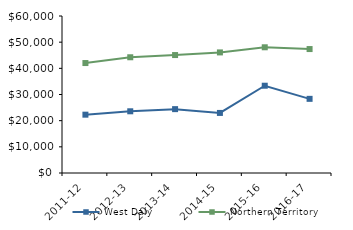
| Category | West Daly | Northern Territory |
|---|---|---|
| 2011-12 | 22290 | 42021 |
| 2012-13 | 23584.21 | 44232.02 |
| 2013-14 | 24406.63 | 45075.51 |
| 2014-15 | 22954.07 | 46083.65 |
| 2015-16 | 33355.46 | 48046.27 |
| 2016-17 | 28341.18 | 47367.05 |